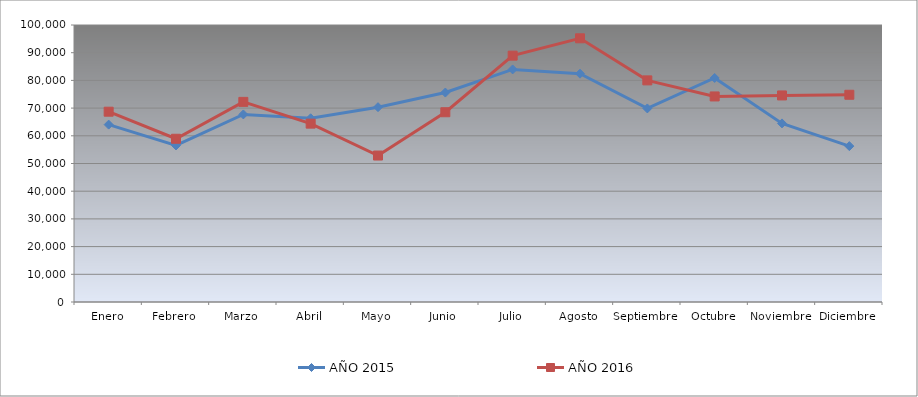
| Category | AÑO 2015 | AÑO 2016 |
|---|---|---|
| Enero | 64039.04 | 68701.5 |
| Febrero | 56509.361 | 58934.409 |
| Marzo | 67714.522 | 72251.032 |
| Abril | 66325.155 | 64392.62 |
| Mayo | 70340.026 | 52875.866 |
| Junio | 75618.61 | 68503.211 |
| Julio | 83964.304 | 88935.225 |
| Agosto | 82428.505 | 95198.179 |
| Septiembre | 69881.211 | 80008.542 |
| Octubre | 80881.144 | 74206.053 |
| Noviembre | 64475.355 | 74567.409 |
| Diciembre | 56276.96 | 74814.725 |